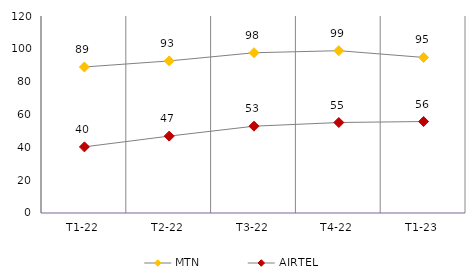
| Category | MTN | AIRTEL | WARID |
|---|---|---|---|
| T1-22 | 88.946 | 40.289 |  |
| T2-22 | 92.628 | 46.842 |  |
| T3-22 | 97.612 | 52.88 |  |
| T4-22 | 98.872 | 55.124 |  |
| T1-23 | 94.754 | 55.723 |  |